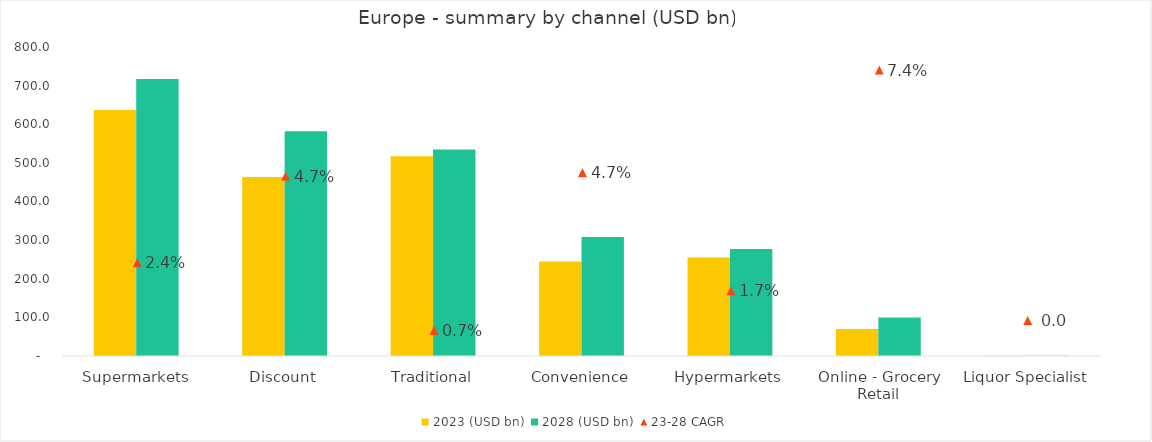
| Category | 2023 (USD bn) | 2028 (USD bn) |
|---|---|---|
| Supermarkets | 636.748 | 717.456 |
| Discount | 463.292 | 581.73 |
| Traditional | 517.003 | 534.334 |
| Convenience | 244.402 | 308.137 |
| Hypermarkets | 254.807 | 277.077 |
| Online - Grocery Retail | 69.913 | 99.913 |
| Liquor Specialist | 0.813 | 0.851 |